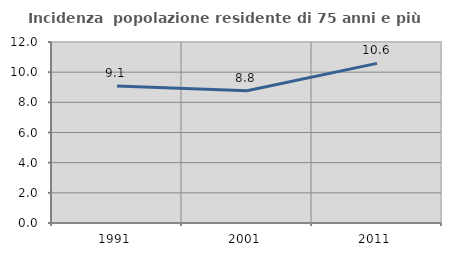
| Category | Incidenza  popolazione residente di 75 anni e più |
|---|---|
| 1991.0 | 9.082 |
| 2001.0 | 8.774 |
| 2011.0 | 10.584 |